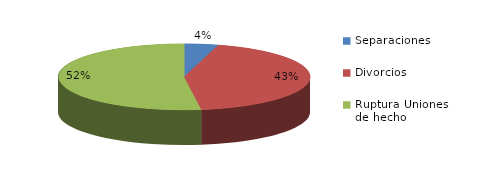
| Category | Series 0 |
|---|---|
| Separaciones | 5 |
| Divorcios | 50 |
| Ruptura Uniones de hecho | 60 |